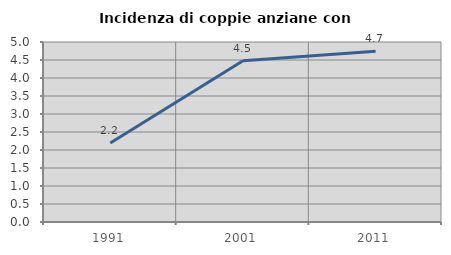
| Category | Incidenza di coppie anziane con figli |
|---|---|
| 1991.0 | 2.194 |
| 2001.0 | 4.481 |
| 2011.0 | 4.741 |